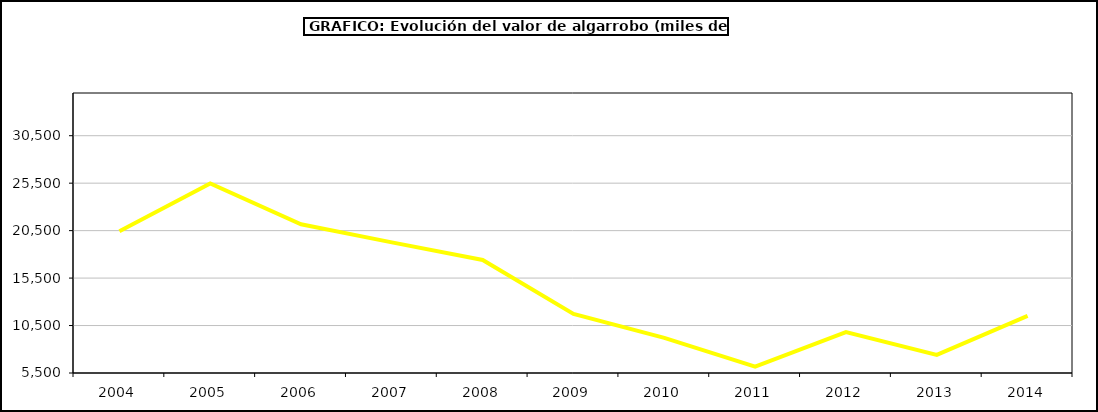
| Category | producción |
|---|---|
| 2004.0 | 20440.566 |
| 2005.0 | 25460.226 |
| 2006.0 | 21170.578 |
| 2007.0 | 19261.476 |
| 2008.0 | 17411.688 |
| 2009.0 | 11720.401 |
| 2010.0 | 9197.132 |
| 2011.0 | 6163.828 |
| 2012.0 | 9804.883 |
| 2013.0 | 7410.909 |
| 2014.0 | 11518 |